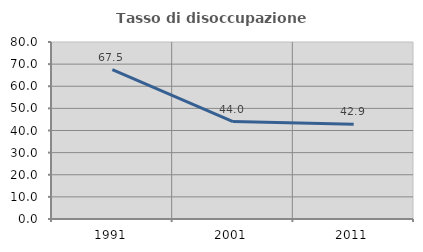
| Category | Tasso di disoccupazione giovanile  |
|---|---|
| 1991.0 | 67.47 |
| 2001.0 | 44.019 |
| 2011.0 | 42.857 |